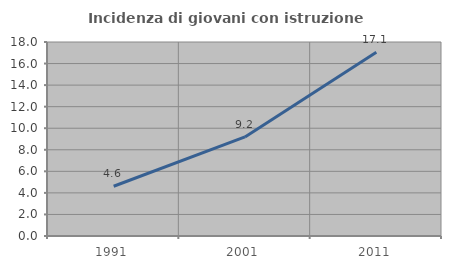
| Category | Incidenza di giovani con istruzione universitaria |
|---|---|
| 1991.0 | 4.615 |
| 2001.0 | 9.191 |
| 2011.0 | 17.058 |